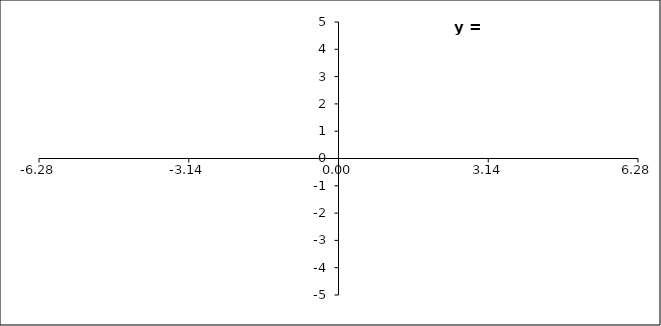
| Category | Series 0 |
|---|---|
|  | 0 |
|  | 0 |
|  | 0 |
|  | 0 |
|  | 0 |
|  | 0 |
|  | 0 |
|  | 0 |
|  | 0 |
|  | 0 |
|  | 0 |
|  | 0 |
|  | 0 |
|  | 0 |
|  | 0 |
|  | 0 |
|  | 0 |
|  | 0 |
|  | 0 |
|  | 0 |
|  | 0 |
|  | 0 |
|  | 0 |
|  | 0 |
|  | 0 |
|  | 0 |
|  | 0 |
|  | 0 |
|  | 0 |
|  | 0 |
|  | 0 |
|  | 0 |
|  | 0 |
|  | 0 |
|  | 0 |
|  | 0 |
|  | 0 |
|  | 0 |
|  | 0 |
|  | 0 |
|  | 0 |
|  | 0 |
|  | 0 |
|  | 0 |
|  | 0 |
|  | 0 |
|  | 0 |
|  | 0 |
|  | 0 |
|  | 0 |
|  | 0 |
|  | 0 |
|  | 0 |
|  | 0 |
|  | 0 |
|  | 0 |
|  | 0 |
|  | 0 |
|  | 0 |
|  | 0 |
|  | 0 |
|  | 0 |
|  | 0 |
|  | 0 |
|  | 0 |
|  | 0 |
|  | 0 |
|  | 0 |
|  | 0 |
|  | 0 |
|  | 0 |
|  | 0 |
|  | 0 |
|  | 0 |
|  | 0 |
|  | 0 |
|  | 0 |
|  | 0 |
|  | 0 |
|  | 0 |
|  | 0 |